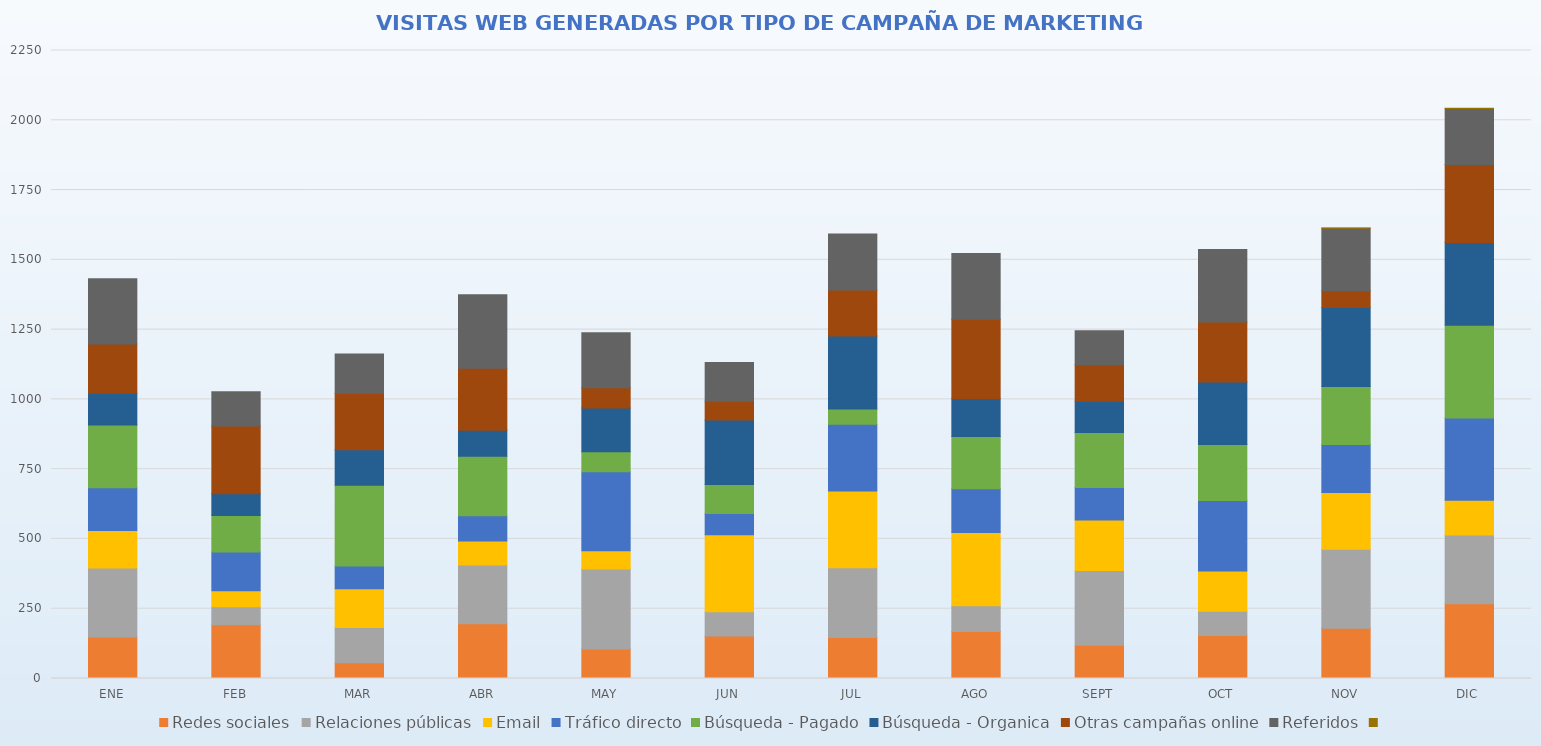
| Category | Redes sociales | Relaciones públicas | Email | Tráfico directo | Búsqueda - Pagado | Búsqueda - Organica | Otras campañas online | Referidos | Series 9 |
|---|---|---|---|---|---|---|---|---|---|
| ENE | 149 | 247 | 134 | 153 | 225 | 114 | 176 | 234 | 0 |
| FEB | 193 | 64 | 57 | 139 | 131 | 78 | 243 | 122 | 0 |
| MAR | 56 | 127 | 139 | 81 | 289 | 128 | 202 | 141 | 0 |
| ABR | 196 | 211 | 86 | 90 | 213 | 93 | 223 | 263 | 0 |
| MAY | 106 | 286 | 66 | 283 | 71 | 157 | 73 | 197 | 0 |
| JUN | 152 | 87 | 276 | 76 | 104 | 231 | 67 | 139 | 0 |
| JUL | 147 | 250 | 275 | 239 | 55 | 261 | 165 | 201 | 0 |
| AGO | 168 | 93 | 262 | 157 | 187 | 136 | 284 | 236 | 0 |
| SEPT | 119 | 268 | 181 | 116 | 197 | 112 | 131 | 122 | 0 |
| OCT | 154 | 87 | 144 | 253 | 200 | 224 | 215 | 260 | 0 |
| NOV | 180 | 283 | 203 | 172 | 208 | 283 | 60 | 224 | 1 |
| DIC | 268 | 246 | 125 | 294 | 333 | 296 | 280 | 200 | 1 |